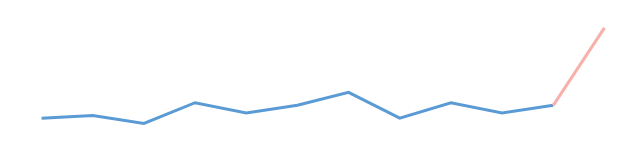
| Category | Series 0 |
|---|---|
| 0 | 10 |
| 1 | 11 |
| 2 | 8 |
| 3 | 16 |
| 4 | 12 |
| 5 | 15 |
| 6 | 20 |
| 7 | 10 |
| 8 | 16 |
| 9 | 12 |
| 10 | 15 |
| 11 | 45 |